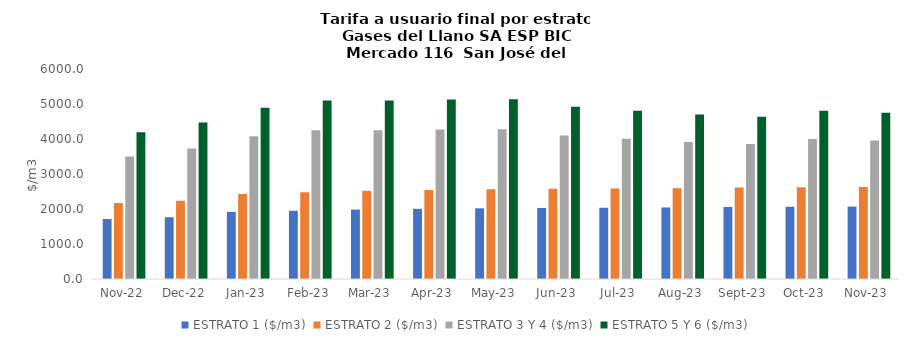
| Category | ESTRATO 1 ($/m3) | ESTRATO 2 ($/m3) | ESTRATO 3 Y 4 ($/m3) | ESTRATO 5 Y 6 ($/m3) |
|---|---|---|---|---|
| 2022-11-01 | 1714.74 | 2172.52 | 3496.7 | 4196.04 |
| 2022-12-01 | 1763.93 | 2235.71 | 3725.2 | 4470.24 |
| 2023-01-01 | 1916.75 | 2431.28 | 4077.6 | 4893.12 |
| 2023-02-01 | 1951.54 | 2475.41 | 4250.37 | 5100.444 |
| 2023-03-01 | 1984.02 | 2519.25 | 4250.37 | 5100.444 |
| 2023-04-01 | 2005.09 | 2546.01 | 4273.76 | 5128.512 |
| 2023-05-01 | 2020.1 | 2565.07 | 4279.7 | 5135.64 |
| 2023-06-01 | 2028.44 | 2575.66 | 4098.64 | 4918.368 |
| 2023-07-01 | 2034.66 | 2583.55 | 4008.82 | 4810.584 |
| 2023-08-01 | 2044.67 | 2596.26 | 3914.14 | 4696.968 |
| 2023-09-01 | 2059.07 | 2614.55 | 3860.26 | 4632.312 |
| 2023-10-01 | 2063.47 | 2620.13 | 4003.57 | 4804.284 |
| 2023-11-01 | 2068.62 | 2626.68 | 3959.2 | 4751.04 |